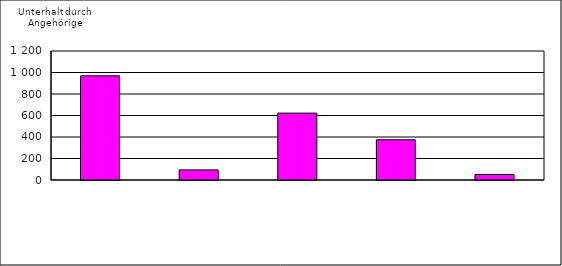
| Category | Series 0 |
|---|---|
| 0 | 969 |
| 1 | 94 |
| 2 | 622 |
| 3 | 374 |
| 4 | 51 |